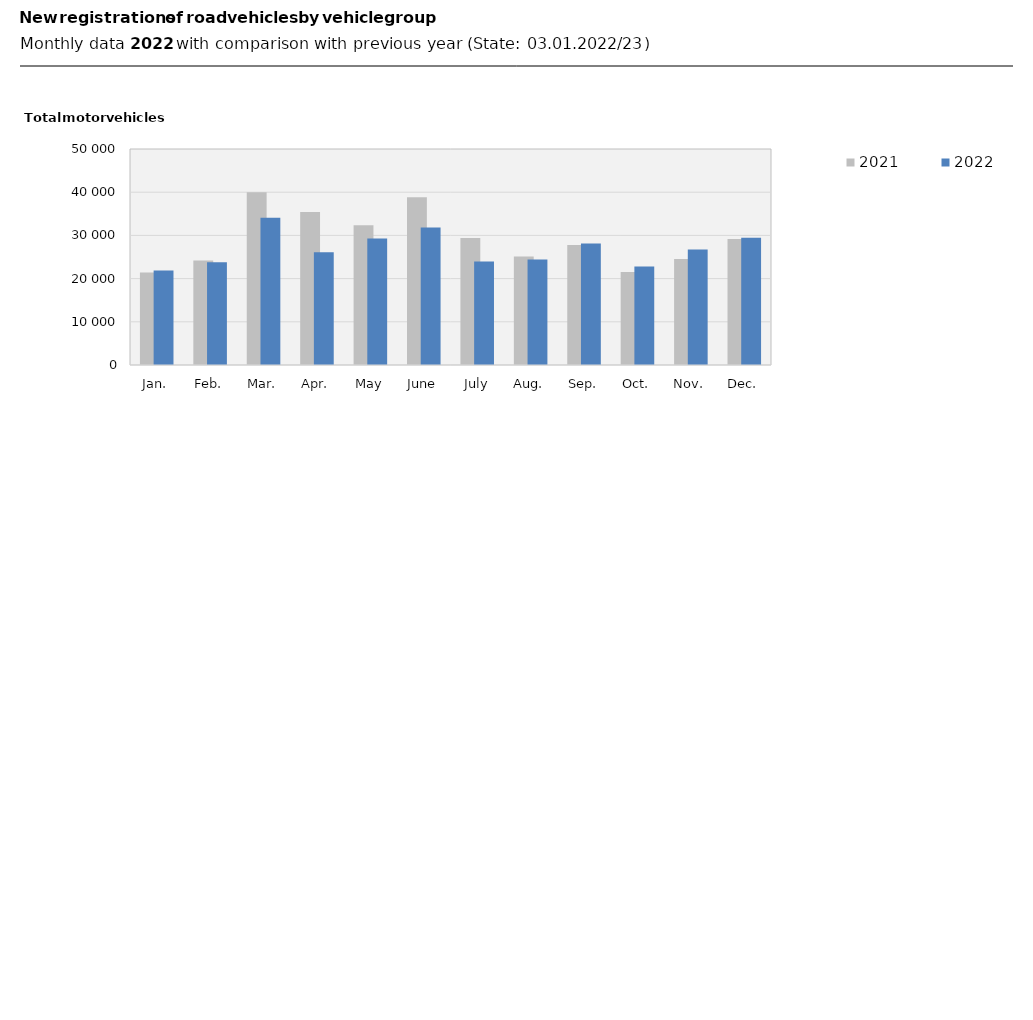
| Category | 2021 | 2022 |
|---|---|---|
| Jan. | 21417 | 21866 |
| Feb. | 24177 | 23784 |
| Mar. | 40000 | 34075 |
| Apr. | 35400 | 26079 |
| May | 32326 | 29254 |
| June | 38853 | 31810 |
| July | 29414 | 23983 |
| Aug. | 25107 | 24433 |
| Sep. | 27750 | 28123 |
| Oct. | 21528 | 22806 |
| Nov. | 24537 | 26724 |
| Dec. | 29156 | 29450 |